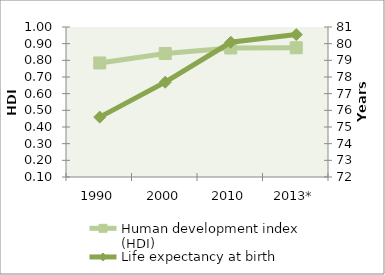
| Category | Human development index (HDI) |
|---|---|
| 1990 | 0.784 |
| 2000 | 0.841 |
| 2010 | 0.874 |
| 2013* | 0.875 |